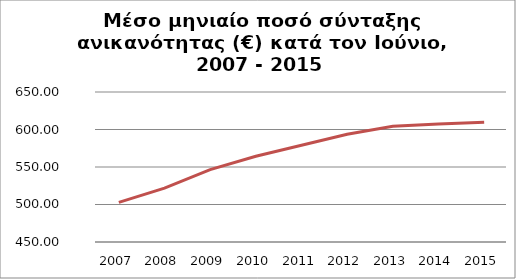
| Category | Series 1 |
|---|---|
| 2007.0 | 502.814 |
| 2008.0 | 521.879 |
| 2009.0 | 546.531 |
| 2010.0 | 564.26 |
| 2011.0 | 578.914 |
| 2012.0 | 593.581 |
| 2013.0 | 604.194 |
| 2014.0 | 607.259 |
| 2015.0 | 609.599 |